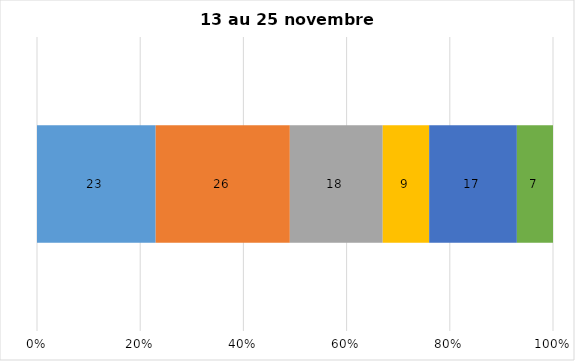
| Category | Plusieurs fois par jour | Une fois par jour | Quelques fois par semaine   | Une fois par semaine ou moins   |  Jamais   |  Je n’utilise pas les médias sociaux |
|---|---|---|---|---|---|---|
| 0 | 23 | 26 | 18 | 9 | 17 | 7 |